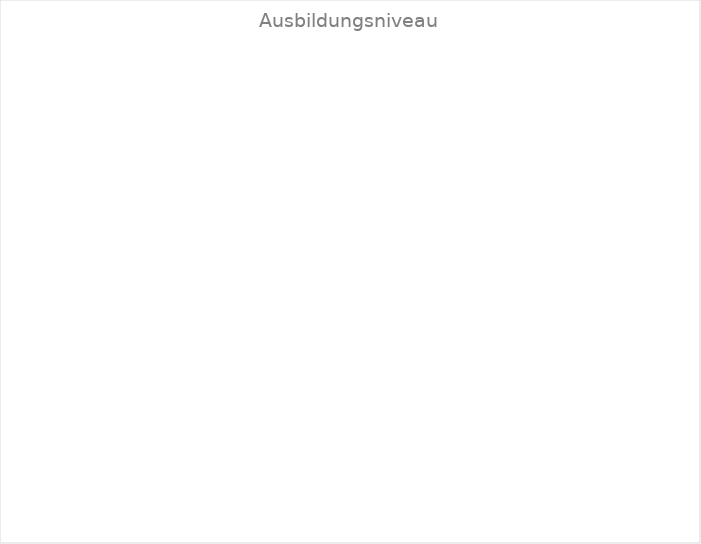
| Category | EFZ | Series 1 |
|---|---|---|
| EFZ | 0 | 0 |
| EBA | 0 | 0 |
| PrA | IV-Anlehre | n. BBG anerkannt | 0 | 0 |
| Praktischer Teil in der Institution
Ausbildung in der Institution | 0 | 0 |
| Praktischer Teil in der Institution und im 1.AM
Reduzierter Tarif ab 4. Monat im 1. AM | 0 | 0 |
| Supported Education im 1. AM
Ausbildung in Kooperation mit dem 1. AM | 0 | 0 |
| Supported Education im 1. Arbeitsmarkt
Ausbildung im Lehrverbund mit dem 1. AM | 0 | 0 |
| Andere Ausbilungen zur beruflichen Eingliederung | 0 | 0 |